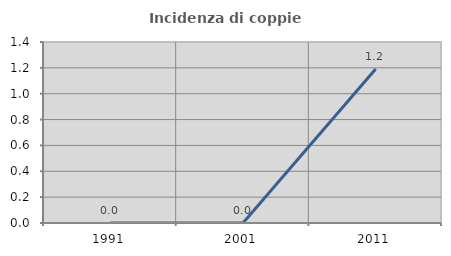
| Category | Incidenza di coppie miste |
|---|---|
| 1991.0 | 0 |
| 2001.0 | 0 |
| 2011.0 | 1.19 |